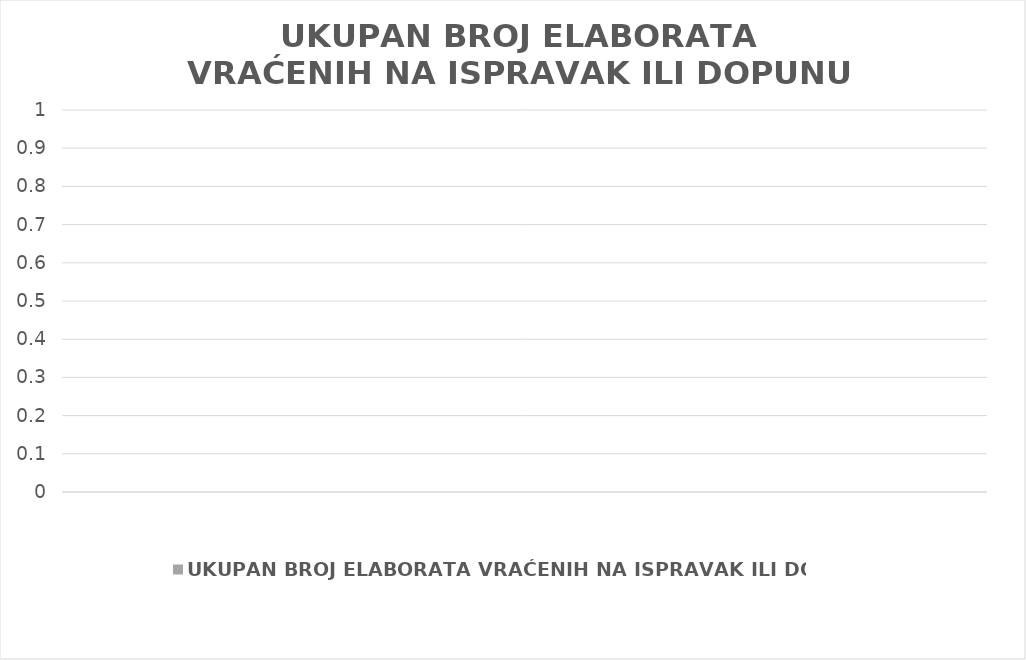
| Category | UKUPAN BROJ ELABORATA VRAĆENIH NA ISPRAVAK ILI DOPUNU |
|---|---|
|  | 0 |
|  | 0 |
|  | 0 |